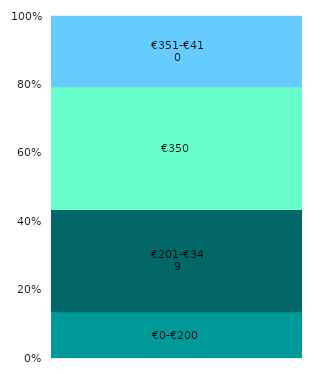
| Category | €0-€200 | €201-€349 | €350 | €351-€410 |
|---|---|---|---|---|
| 0 | 0.137 | 0.299 | 0.359 | 0.206 |